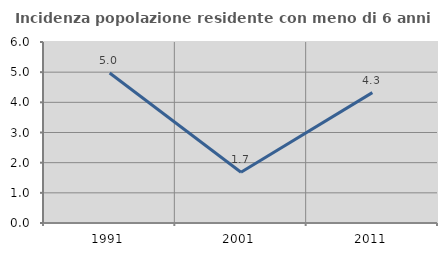
| Category | Incidenza popolazione residente con meno di 6 anni |
|---|---|
| 1991.0 | 4.974 |
| 2001.0 | 1.681 |
| 2011.0 | 4.323 |